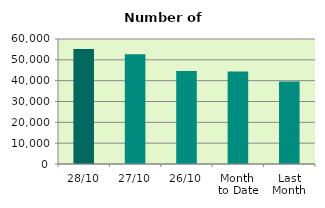
| Category | Series 0 |
|---|---|
| 28/10 | 55240 |
| 27/10 | 52676 |
| 26/10 | 44588 |
| Month 
to Date | 44416 |
| Last
Month | 39557.091 |